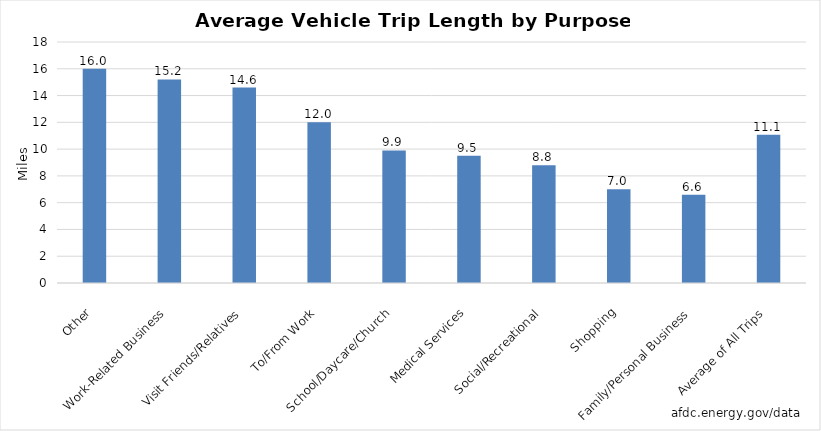
| Category | Average Vehicle Trip Length by Purpose, 2017 |
|---|---|
| Other | 16 |
| Work-Related Business | 15.2 |
| Visit Friends/Relatives | 14.6 |
| To/From Work | 12 |
| School/Daycare/Church | 9.9 |
| Medical Services | 9.5 |
| Social/Recreational | 8.8 |
| Shopping | 7 |
| Family/Personal Business | 6.6 |
| Average of All Trips | 11.067 |